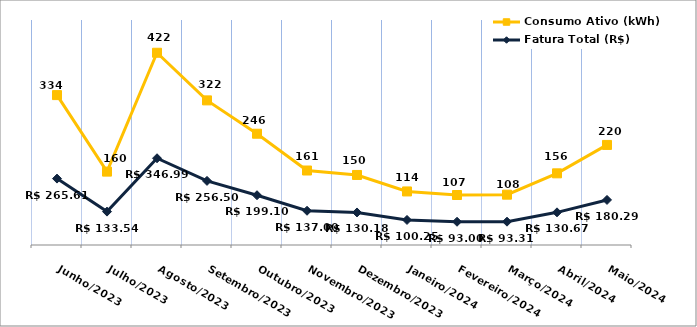
| Category | Fatura Total (R$) | Consumo Ativo (kWh) |
|---|---|---|
| Junho/2023 | 265.61 | 334 |
| Julho/2023 | 133.54 | 160 |
| Agosto/2023 | 346.99 | 422 |
| Setembro/2023 | 256.5 | 322 |
| Outubro/2023 | 199.1 | 246 |
| Novembro/2023 | 137 | 161 |
| Dezembro/2023 | 130.18 | 150 |
| Janeiro/2024 | 100.25 | 114 |
| Fevereiro/2024 | 93 | 107 |
| Março/2024 | 93.31 | 108 |
| Abril/2024 | 130.67 | 156 |
| Maio/2024 | 180.29 | 220 |